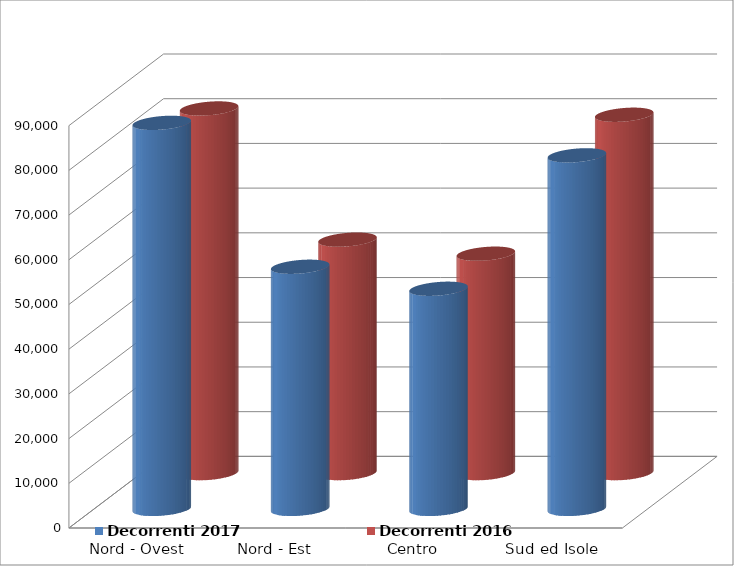
| Category | Decorrenti 2017 | Decorrenti 2016 |
|---|---|---|
| Nord - Ovest | 86349 | 81558 |
| Nord - Est | 54162 | 52218 |
| Centro | 49240 | 49073 |
| Sud ed Isole | 79084 | 80152 |